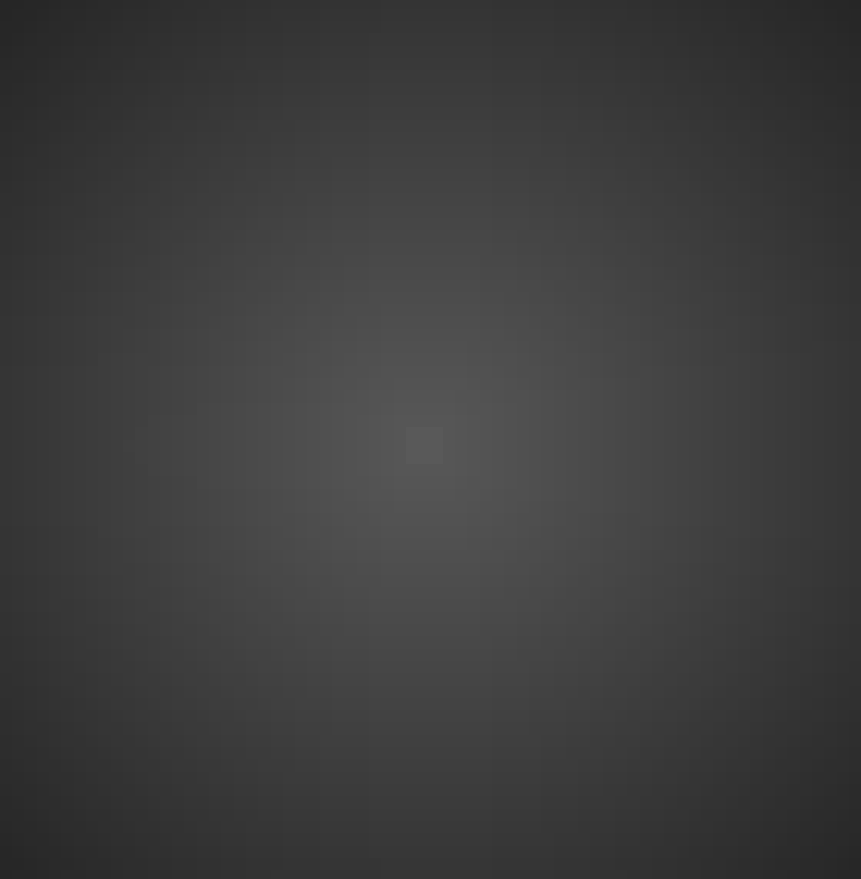
| Category | Total |
|---|---|
| 100300 PREFEITURA UNIVERSITÁRIA | 49.15 |
| 110310 DIVISÃO DE CONCURSOS | 699 |
| 180000 CTUR | 678.24 |
| 190000 CAMPUS DR. LEONEL MIRANDA | 1615.6 |
| 210400 DEPARTAMENTO DE PETROLOGIA E GEOTECTÔNICA | 57.9 |
| 240000 INSTITUTO DE CIÊNCIAS HUMANAS E SOCIAIS | 502.4 |
| 250000 INSTITUTO DE EDUCAÇÃO | 294.9 |
| 260000 INSTITUTO DE FLORESTAS | 91.97 |
| 280300 DEPTO DE MICROBIOLOGIA E IMUNOLOGIA VETERINÁRIA | 68.5 |
| 290000 INSTITUTO DE ZOOTECNIA | 125.6 |
| 400000 CAMPUS DA UFRRJ EM TRÊS RIOS | 965.6 |